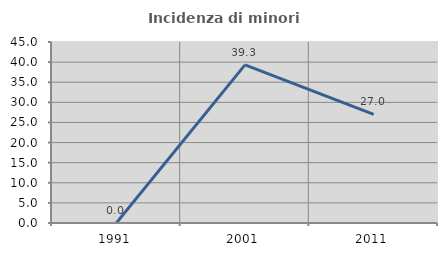
| Category | Incidenza di minori stranieri |
|---|---|
| 1991.0 | 0 |
| 2001.0 | 39.316 |
| 2011.0 | 27.027 |